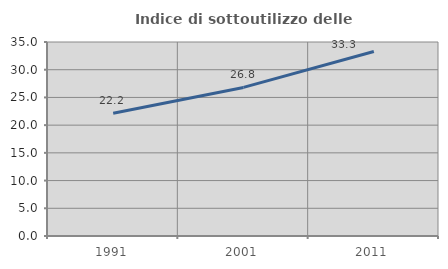
| Category | Indice di sottoutilizzo delle abitazioni  |
|---|---|
| 1991.0 | 22.155 |
| 2001.0 | 26.806 |
| 2011.0 | 33.284 |